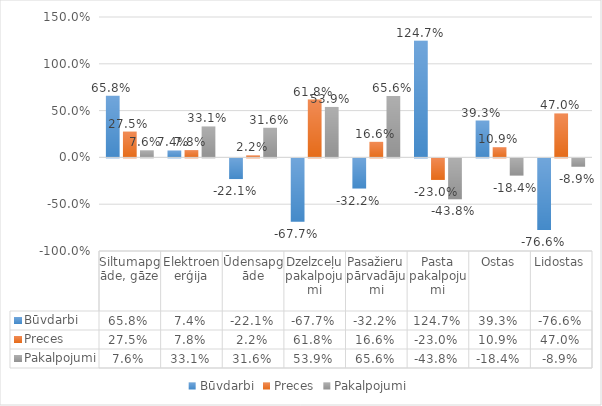
| Category | Būvdarbi | Preces | Pakalpojumi |
|---|---|---|---|
| Siltumapgāde, gāze | 0.658 | 0.275 | 0.076 |
| Elektroenerģija | 0.074 | 0.078 | 0.331 |
| Ūdensapgāde | -0.221 | 0.022 | 0.316 |
| Dzelzceļu pakalpojumi | -0.677 | 0.618 | 0.539 |
| Pasažieru pārvadājumi | -0.322 | 0.166 | 0.656 |
| Pasta pakalpojumi | 1.247 | -0.23 | -0.438 |
| Ostas | 0.393 | 0.109 | -0.184 |
| Lidostas | -0.766 | 0.47 | -0.089 |